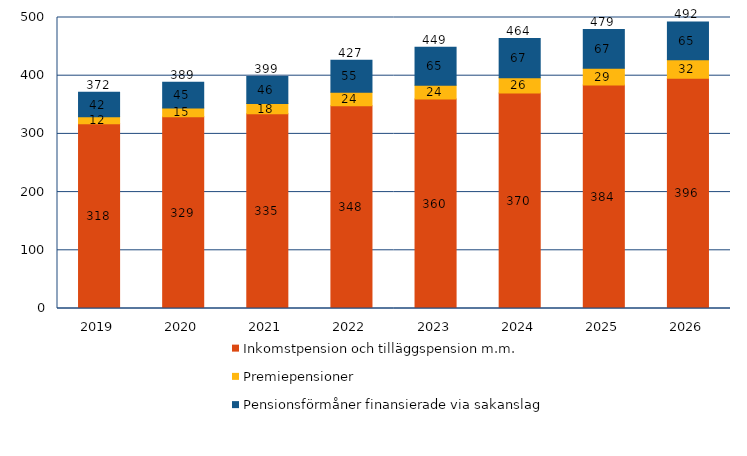
| Category | Inkomstpension och tilläggspension m.m. | Premiepensioner | Pensionsförmåner finansierade via sakanslag | Series 3 |
|---|---|---|---|---|
| 2019.0 | 317.628 | 11.715 | 42.22 | 371.563 |
| 2020.0 | 329.365 | 15.016 | 44.546 | 388.927 |
| 2021.0 | 334.563 | 17.837 | 46.327 | 398.727 |
| 2022.0 | 348.167 | 23.519 | 55.011 | 426.697 |
| 2023.0 | 359.825 | 23.904 | 65.33 | 449.059 |
| 2024.0 | 370.291 | 26.141 | 67.385 | 463.817 |
| 2025.0 | 383.831 | 28.977 | 66.564 | 479.372 |
| 2026.0 | 395.798 | 31.677 | 64.99 | 492.465 |